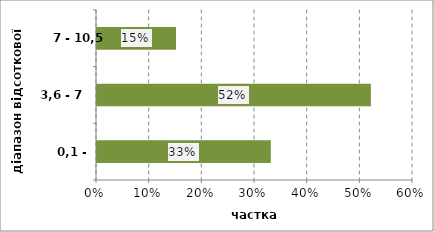
| Category | Series 0 |
|---|---|
| 0,1 - 3,6 | 0.33 |
| 3,6 - 7 | 0.52 |
| 7 - 10,5 | 0.15 |